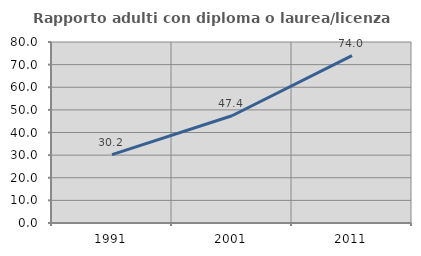
| Category | Rapporto adulti con diploma o laurea/licenza media  |
|---|---|
| 1991.0 | 30.249 |
| 2001.0 | 47.397 |
| 2011.0 | 73.977 |